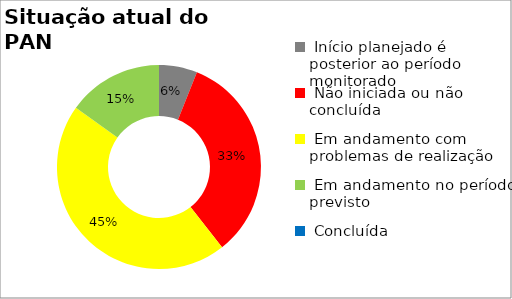
| Category | Series 0 |
|---|---|
|  Início planejado é posterior ao período monitorado | 0.061 |
|  Não iniciada ou não concluída | 0.333 |
|  Em andamento com problemas de realização | 0.455 |
|  Em andamento no período previsto  | 0.152 |
|  Concluída | 0 |